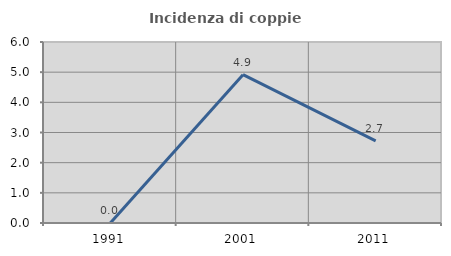
| Category | Incidenza di coppie miste |
|---|---|
| 1991.0 | 0 |
| 2001.0 | 4.918 |
| 2011.0 | 2.721 |